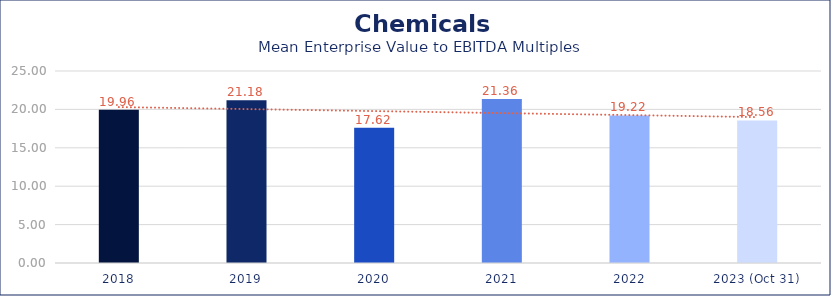
| Category | Chemicals |
|---|---|
| 2018 | 19.96 |
| 2019 | 21.18 |
| 2020 | 17.62 |
| 2021 | 21.36 |
| 2022 | 19.22 |
| 2023 (Oct 31) | 18.56 |